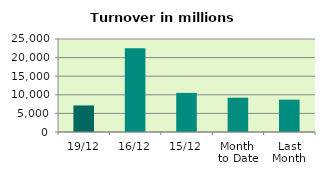
| Category | Series 0 |
|---|---|
| 19/12 | 7133.198 |
| 16/12 | 22491.541 |
| 15/12 | 10515.077 |
| Month 
to Date | 9224.324 |
| Last
Month | 8686.894 |